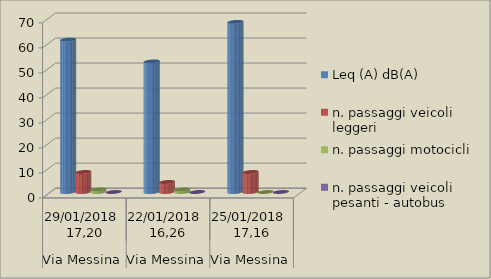
| Category | Leq (A) dB(A) | n. passaggi veicoli leggeri  | n. passaggi motocicli | n. passaggi veicoli pesanti - autobus  |
|---|---|---|---|---|
| 0 | 60.9 | 8 | 1 | 0 |
| 1 | 52.2 | 4 | 1 | 0 |
| 2 | 68 | 8 | 0 | 0 |